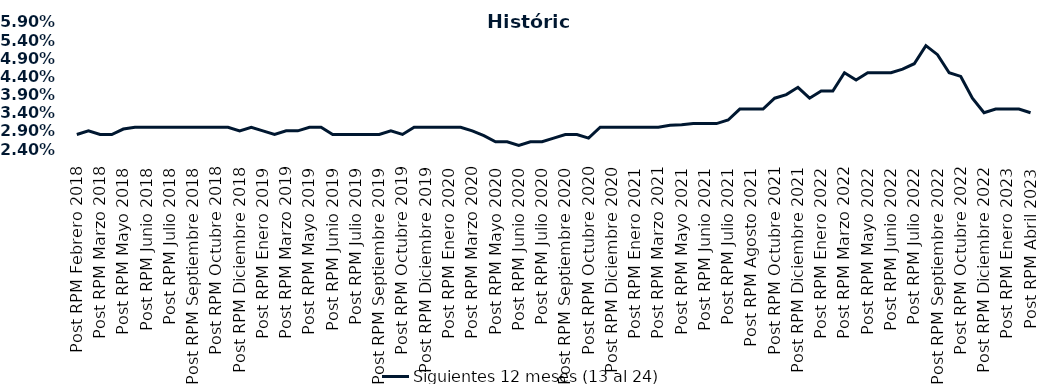
| Category | Siguientes 12 meses (13 al 24)  |
|---|---|
| Post RPM Febrero 2018 | 0.028 |
| Pre RPM Marzo 2018 | 0.029 |
| Post RPM Marzo 2018 | 0.028 |
| Pre RPM Mayo 2018 | 0.028 |
| Post RPM Mayo 2018 | 0.03 |
| Pre RPM Junio 2018 | 0.03 |
| Post RPM Junio 2018 | 0.03 |
| Pre RPM Julio 2018 | 0.03 |
| Post RPM Julio 2018 | 0.03 |
| Pre RPM Septiembre 2018 | 0.03 |
| Post RPM Septiembre 2018 | 0.03 |
| Pre RPM Octubre 2018 | 0.03 |
| Post RPM Octubre 2018 | 0.03 |
| Pre RPM Diciembre 2018 | 0.03 |
| Post RPM Diciembre 2018 | 0.029 |
| Pre RPM Enero 2019 | 0.03 |
| Post RPM Enero 2019 | 0.029 |
| Pre RPM Marzo 2019 | 0.028 |
| Post RPM Marzo 2019 | 0.029 |
| Pre RPM Mayo 2019 | 0.029 |
| Post RPM Mayo 2019 | 0.03 |
| Pre RPM Junio 2019 | 0.03 |
| Post RPM Junio 2019 | 0.028 |
| Pre RPM Julio 2019 | 0.028 |
| Post RPM Julio 2019 | 0.028 |
| Pre RPM Septiembre 2019 | 0.028 |
| Post RPM Septiembre 2019 | 0.028 |
| Pre RPM Octubre 2019 | 0.029 |
| Post RPM Octubre 2019 | 0.028 |
| Pre RPM Diciembre 2019 | 0.03 |
| Post RPM Diciembre 2019 | 0.03 |
| Pre RPM Enero 2020 | 0.03 |
| Post RPM Enero 2020 | 0.03 |
| Pre RPM Marzo 2020 | 0.03 |
| Post RPM Marzo 2020 | 0.029 |
| Pre RPM Mayo 2020 | 0.028 |
| Post RPM Mayo 2020 | 0.026 |
| Pre RPM Junio 2020 | 0.026 |
| Post RPM Junio 2020 | 0.025 |
| Pre RPM Julio 2020 | 0.026 |
| Post RPM Julio 2020 | 0.026 |
| Pre RPM Septiembre 2020 | 0.027 |
| Post RPM Septiembre 2020 | 0.028 |
| Pre RPM Octubre 2020 | 0.028 |
| Post RPM Octubre 2020 | 0.027 |
| Pre RPM Diciembre 2020 | 0.03 |
| Post RPM Diciembre 2020 | 0.03 |
| Pre RPM Enero 2021 | 0.03 |
| Post RPM Enero 2021 | 0.03 |
| Pre RPM Marzo 2021 | 0.03 |
| Post RPM Marzo 2021 | 0.03 |
| Pre RPM Mayo 2021 | 0.031 |
| Post RPM Mayo 2021 | 0.031 |
| Pre RPM Junio 2021 | 0.031 |
| Post RPM Junio 2021 | 0.031 |
| Pre RPM Julio 2021 | 0.031 |
| Post RPM Julio 2021 | 0.032 |
| Pre RPM Agosto 2021 | 0.035 |
| Post RPM Agosto 2021 | 0.035 |
| Pre RPM Octubre 2021 | 0.035 |
| Post RPM Octubre 2021 | 0.038 |
| Pre RPM Diciembre 2021 | 0.039 |
| Post RPM Diciembre 2021 | 0.041 |
| Pre RPM Enero 2022 | 0.038 |
| Post RPM Enero 2022 | 0.04 |
| Pre RPM Marzo 2022 | 0.04 |
| Post RPM Marzo 2022 | 0.045 |
| Pre RPM Mayo 2022 | 0.043 |
| Post RPM Mayo 2022 | 0.045 |
| Pre RPM Junio 2022 | 0.045 |
| Post RPM Junio 2022 | 0.045 |
| Pre RPM Julio 2022 | 0.046 |
| Post RPM Julio 2022 | 0.048 |
| Pre RPM Septiembre 2022 | 0.052 |
| Post RPM Septiembre 2022 | 0.05 |
| Pre RPM Octubre 2022 | 0.045 |
| Post RPM Octubre 2022 | 0.044 |
| Pre RPM Diciembre 2022 | 0.038 |
| Post RPM Diciembre 2022 | 0.034 |
| Pre RPM Enero 2023 | 0.035 |
| Post RPM Enero 2023 | 0.035 |
| Pre RPM Abril 2023 | 0.035 |
| Post RPM Abril 2023 | 0.034 |